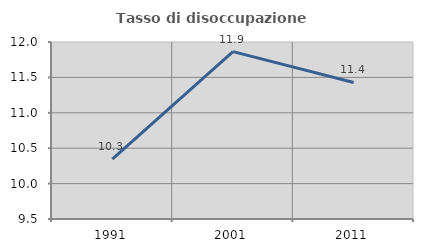
| Category | Tasso di disoccupazione giovanile  |
|---|---|
| 1991.0 | 10.345 |
| 2001.0 | 11.864 |
| 2011.0 | 11.429 |